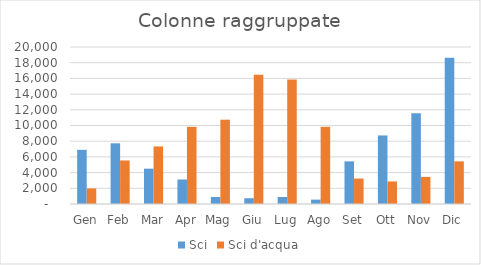
| Category | Sci | Sci d'acqua |
|---|---|---|
| Gen | 6897 | 1983 |
| Feb | 7732 | 5547 |
| Mar | 4500 | 7330 |
| Apr | 3122 | 9832 |
| Mag | 893 | 10739 |
| Giu | 734 | 16453 |
| Lug | 891 | 15874 |
| Ago | 559 | 9833 |
| Set | 5433 | 3244 |
| Ott | 8734 | 2873 |
| Nov | 11573 | 3459 |
| Dic | 18630 | 5433 |